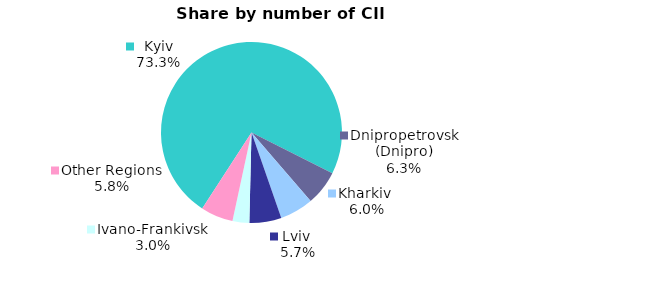
| Category | Series 0 |
|---|---|
| Kyiv | 0.733 |
| Dnipropetrovsk (Dnipro) | 0.063 |
| Kharkiv  | 0.06 |
| Lviv  | 0.057 |
| Ivano-Frankivsk | 0.03 |
| Other Regions | 0.058 |